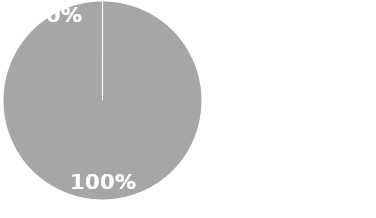
| Category | Series 0 |
|---|---|
| Posibles Riesgos en la Implementación del Cambio | 0 |
| Posibles Habilitadores en la Implementación del Cambio | 1 |